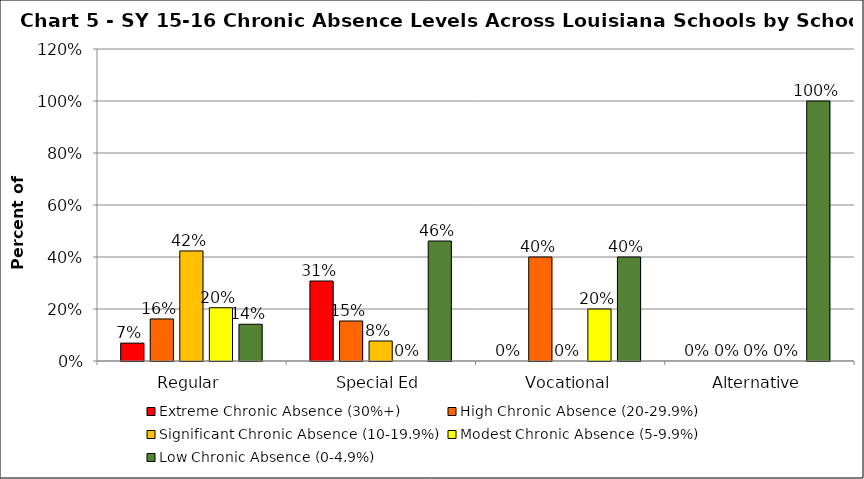
| Category | Extreme Chronic Absence (30%+) | High Chronic Absence (20-29.9%) | Significant Chronic Absence (10-19.9%) | Modest Chronic Absence (5-9.9%) | Low Chronic Absence (0-4.9%) |
|---|---|---|---|---|---|
| 0 | 0.069 | 0.162 | 0.423 | 0.205 | 0.141 |
| 1 | 0.308 | 0.154 | 0.077 | 0 | 0.462 |
| 2 | 0 | 0.4 | 0 | 0.2 | 0.4 |
| 3 | 0 | 0 | 0 | 0 | 1 |